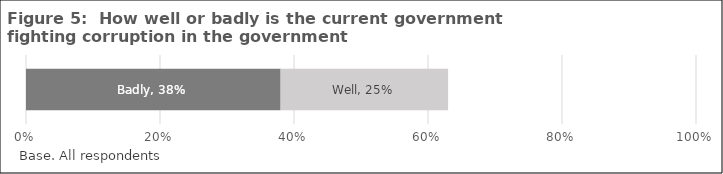
| Category | Badly | Well |
|---|---|---|
| 0 | 0.38 | 0.25 |